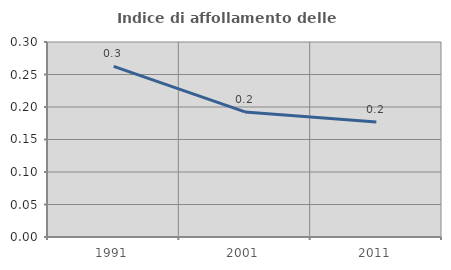
| Category | Indice di affollamento delle abitazioni  |
|---|---|
| 1991.0 | 0.262 |
| 2001.0 | 0.192 |
| 2011.0 | 0.177 |